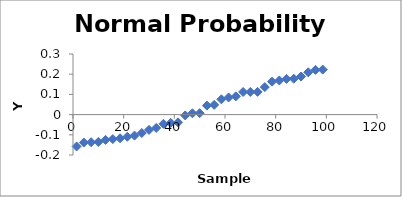
| Category | Series 0 |
|---|---|
| 1.4285714285714286 | -0.158 |
| 4.285714285714286 | -0.138 |
| 7.142857142857143 | -0.137 |
| 10.0 | -0.136 |
| 12.857142857142858 | -0.125 |
| 15.714285714285715 | -0.121 |
| 18.57142857142857 | -0.117 |
| 21.428571428571427 | -0.11 |
| 24.285714285714285 | -0.104 |
| 27.142857142857142 | -0.091 |
| 30.0 | -0.076 |
| 32.85714285714286 | -0.066 |
| 35.714285714285715 | -0.046 |
| 38.57142857142858 | -0.041 |
| 41.42857142857143 | -0.038 |
| 44.28571428571429 | -0.004 |
| 47.142857142857146 | 0.006 |
| 50.0 | 0.007 |
| 52.85714285714286 | 0.045 |
| 55.714285714285715 | 0.048 |
| 58.57142857142858 | 0.076 |
| 61.42857142857143 | 0.085 |
| 64.28571428571429 | 0.09 |
| 67.14285714285715 | 0.112 |
| 70.0 | 0.112 |
| 72.85714285714286 | 0.113 |
| 75.71428571428572 | 0.136 |
| 78.57142857142857 | 0.163 |
| 81.42857142857143 | 0.169 |
| 84.28571428571429 | 0.177 |
| 87.14285714285715 | 0.178 |
| 90.0 | 0.189 |
| 92.85714285714286 | 0.209 |
| 95.71428571428572 | 0.221 |
| 98.57142857142857 | 0.223 |